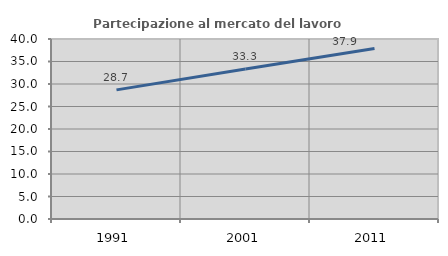
| Category | Partecipazione al mercato del lavoro  femminile |
|---|---|
| 1991.0 | 28.692 |
| 2001.0 | 33.333 |
| 2011.0 | 37.879 |